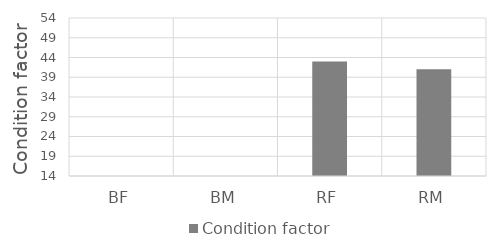
| Category | Condition factor |
|---|---|
| BF | 0 |
| BM | 0 |
| RF | 43 |
| RM | 41 |